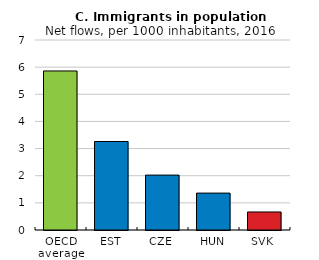
| Category | 2016 |
|---|---|
| OECD average | 5.86 |
| EST | 3.261 |
| CZE | 2.022 |
| HUN | 1.359 |
| SVK | 0.665 |